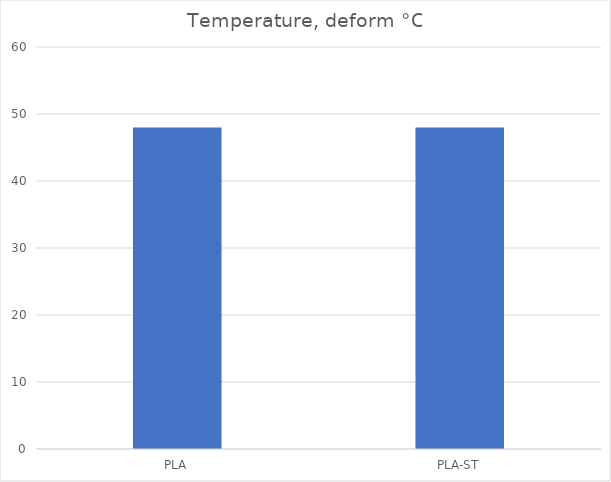
| Category | Deform °C |
|---|---|
| PLA | 48 |
| PLA-ST | 48 |